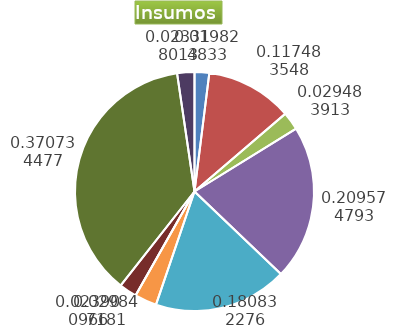
| Category | Series 0 |
|---|---|
| Control arvenses | 1902115 |
| Control fitosanitario | 11272086 |
| Cosecha y beneficio | 2349135.447 |
| Fertilización | 20107880 |
| Instalación | 17350148.127 |
| Otros | 2863720 |
| Podas | 0 |
| Riego | 2293204 |
| Transporte | 35570520 |
| Tutorado | 2237272 |